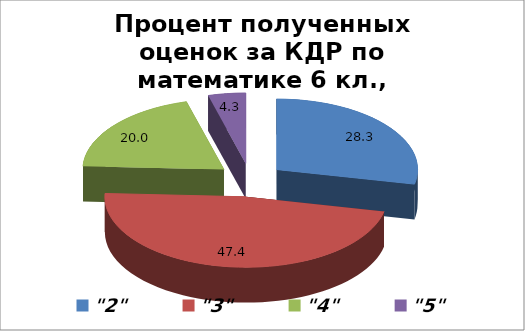
| Category | Series 0 |
|---|---|
| "2" | 28.326 |
| "3" | 47.425 |
| "4" | 19.957 |
| "5" | 4.292 |